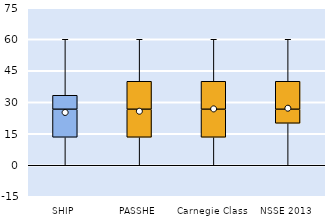
| Category | 25th | 50th | 75th |
|---|---|---|---|
| SHIP | 13.333 | 13.333 | 6.667 |
| PASSHE | 13.333 | 13.333 | 13.333 |
| Carnegie Class | 13.333 | 13.333 | 13.333 |
| NSSE 2013 | 20 | 6.667 | 13.333 |